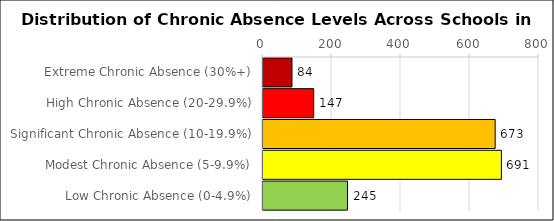
| Category | Number of Schools |
|---|---|
| Extreme Chronic Absence (30%+) | 84 |
| High Chronic Absence (20-29.9%) | 147 |
| Significant Chronic Absence (10-19.9%) | 673 |
| Modest Chronic Absence (5-9.9%) | 691 |
| Low Chronic Absence (0-4.9%) | 245 |